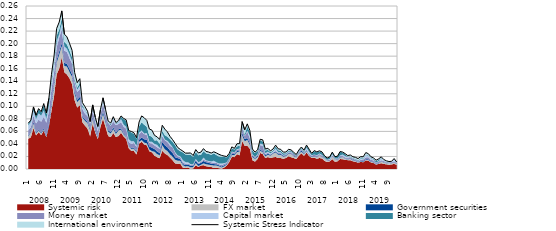
| Category | Systemic Stress Indicator |
|---|---|
| 0 | 0.073 |
| 1 | 0.078 |
| 2 | 0.099 |
| 3 | 0.086 |
| 4 | 0.096 |
| 5 | 0.091 |
| 6 | 0.104 |
| 7 | 0.089 |
| 8 | 0.113 |
| 9 | 0.151 |
| 10 | 0.18 |
| 11 | 0.224 |
| 12 | 0.234 |
| 13 | 0.252 |
| 14 | 0.215 |
| 15 | 0.211 |
| 16 | 0.201 |
| 17 | 0.189 |
| 18 | 0.154 |
| 19 | 0.138 |
| 20 | 0.144 |
| 21 | 0.106 |
| 22 | 0.099 |
| 23 | 0.092 |
| 24 | 0.076 |
| 25 | 0.102 |
| 26 | 0.083 |
| 27 | 0.068 |
| 28 | 0.095 |
| 29 | 0.114 |
| 30 | 0.095 |
| 31 | 0.076 |
| 32 | 0.073 |
| 33 | 0.083 |
| 34 | 0.074 |
| 35 | 0.077 |
| 36 | 0.085 |
| 37 | 0.081 |
| 38 | 0.078 |
| 39 | 0.061 |
| 40 | 0.06 |
| 41 | 0.058 |
| 42 | 0.05 |
| 43 | 0.075 |
| 44 | 0.085 |
| 45 | 0.082 |
| 46 | 0.078 |
| 47 | 0.064 |
| 48 | 0.062 |
| 49 | 0.054 |
| 50 | 0.051 |
| 51 | 0.047 |
| 52 | 0.07 |
| 53 | 0.064 |
| 54 | 0.059 |
| 55 | 0.052 |
| 56 | 0.047 |
| 57 | 0.041 |
| 58 | 0.034 |
| 59 | 0.031 |
| 60 | 0.029 |
| 61 | 0.025 |
| 62 | 0.025 |
| 63 | 0.026 |
| 64 | 0.021 |
| 65 | 0.031 |
| 66 | 0.026 |
| 67 | 0.027 |
| 68 | 0.033 |
| 69 | 0.028 |
| 70 | 0.027 |
| 71 | 0.025 |
| 72 | 0.027 |
| 73 | 0.026 |
| 74 | 0.023 |
| 75 | 0.022 |
| 76 | 0.021 |
| 77 | 0.02 |
| 78 | 0.025 |
| 79 | 0.035 |
| 80 | 0.033 |
| 81 | 0.04 |
| 82 | 0.04 |
| 83 | 0.076 |
| 84 | 0.062 |
| 85 | 0.072 |
| 86 | 0.062 |
| 87 | 0.032 |
| 88 | 0.027 |
| 89 | 0.031 |
| 90 | 0.047 |
| 91 | 0.047 |
| 92 | 0.032 |
| 93 | 0.033 |
| 94 | 0.029 |
| 95 | 0.032 |
| 96 | 0.038 |
| 97 | 0.032 |
| 98 | 0.031 |
| 99 | 0.027 |
| 100 | 0.027 |
| 101 | 0.031 |
| 102 | 0.03 |
| 103 | 0.027 |
| 104 | 0.023 |
| 105 | 0.03 |
| 106 | 0.035 |
| 107 | 0.03 |
| 108 | 0.038 |
| 109 | 0.032 |
| 110 | 0.025 |
| 111 | 0.029 |
| 112 | 0.027 |
| 113 | 0.029 |
| 114 | 0.027 |
| 115 | 0.021 |
| 116 | 0.018 |
| 117 | 0.019 |
| 118 | 0.027 |
| 119 | 0.02 |
| 120 | 0.02 |
| 121 | 0.028 |
| 122 | 0.027 |
| 123 | 0.025 |
| 124 | 0.021 |
| 125 | 0.022 |
| 126 | 0.02 |
| 127 | 0.019 |
| 128 | 0.017 |
| 129 | 0.02 |
| 130 | 0.02 |
| 131 | 0.026 |
| 132 | 0.024 |
| 133 | 0.02 |
| 134 | 0.018 |
| 135 | 0.014 |
| 136 | 0.016 |
| 137 | 0.019 |
| 138 | 0.015 |
| 139 | 0.013 |
| 140 | 0.012 |
| 141 | 0.012 |
| 142 | 0.017 |
| 143 | 0.011 |